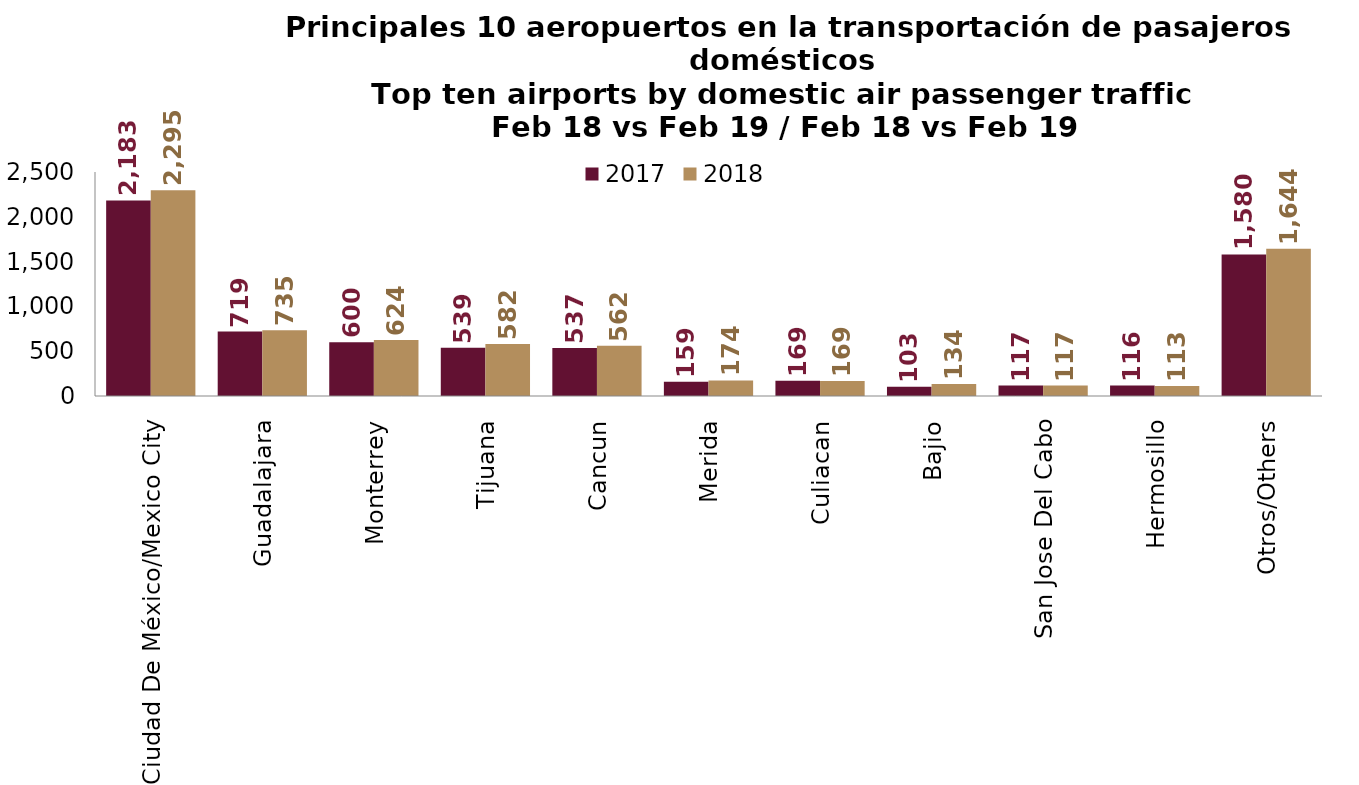
| Category | 2017 | 2018 |
|---|---|---|
| Ciudad De México/Mexico City | 2182.951 | 2295.334 |
| Guadalajara | 718.518 | 734.506 |
| Monterrey | 600.15 | 624.109 |
| Tijuana | 539.427 | 581.607 |
| Cancun | 536.561 | 562.037 |
| Merida | 158.513 | 174.177 |
| Culiacan | 168.878 | 168.686 |
| Bajio | 102.76 | 134.243 |
| San Jose Del Cabo | 116.667 | 116.686 |
| Hermosillo | 116.414 | 112.744 |
| Otros/Others | 1579.529 | 1643.526 |